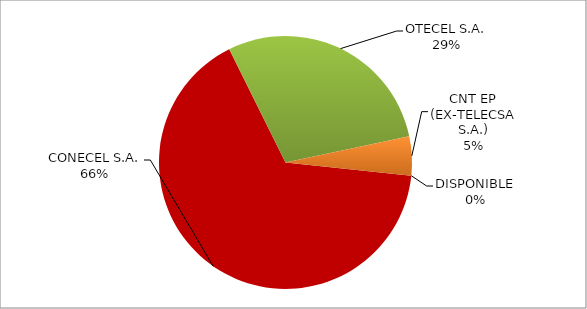
| Category | CÓDIGO DE RED 98 |
|---|---|
| CONECEL S.A. | 0.66 |
| OTECEL S.A. | 0.29 |
| CNT EP (EX-TELECSA S.A.) | 0.05 |
| DISPONIBLE | 0 |